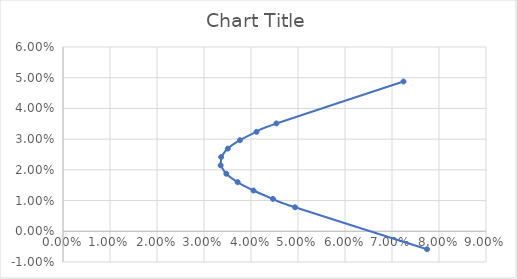
| Category | Series 0 |
|---|---|
| 0.07245060626728853 | 0.049 |
| 0.04540988034094193 | 0.035 |
| 0.04116606395317076 | 0.032 |
| 0.037646121724311164 | 0.03 |
| 0.03506870700544844 | 0.027 |
| 0.03365109228321646 | 0.024 |
| 0.033540660150634186 | 0.021 |
| 0.03474987518674501 | 0.019 |
| 0.037150098765892946 | 0.016 |
| 0.04053028400843092 | 0.013 |
| 0.044668513249936696 | 0.011 |
| 0.04937455114512633 | 0.008 |
| 0.0774639818554774 | -0.006 |